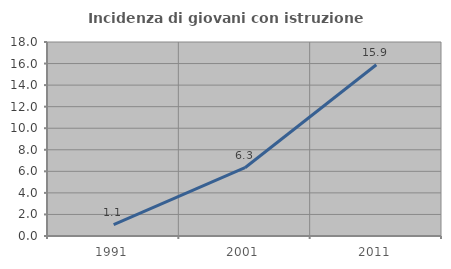
| Category | Incidenza di giovani con istruzione universitaria |
|---|---|
| 1991.0 | 1.052 |
| 2001.0 | 6.337 |
| 2011.0 | 15.886 |